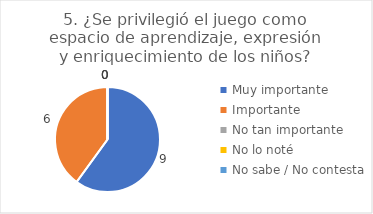
| Category | 5. ¿Se privilegió el juego como espacio de aprendizaje, expresión y enriquecimiento de los niños? |
|---|---|
| Muy importante  | 0.6 |
| Importante  | 0.4 |
| No tan importante  | 0 |
| No lo noté  | 0 |
| No sabe / No contesta | 0 |